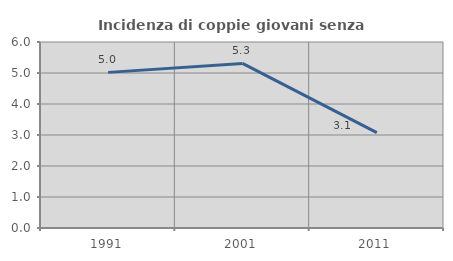
| Category | Incidenza di coppie giovani senza figli |
|---|---|
| 1991.0 | 5.02 |
| 2001.0 | 5.31 |
| 2011.0 | 3.079 |